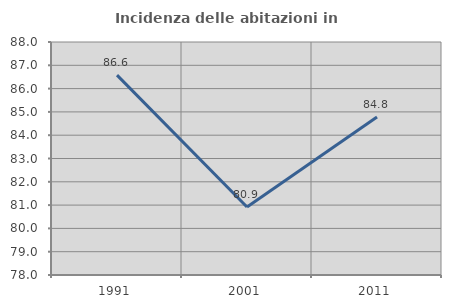
| Category | Incidenza delle abitazioni in proprietà  |
|---|---|
| 1991.0 | 86.577 |
| 2001.0 | 80.918 |
| 2011.0 | 84.777 |